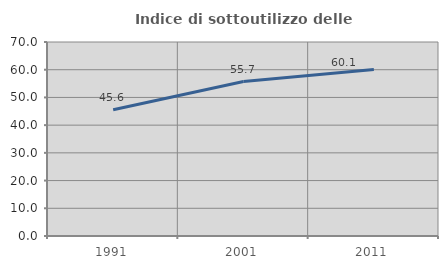
| Category | Indice di sottoutilizzo delle abitazioni  |
|---|---|
| 1991.0 | 45.57 |
| 2001.0 | 55.743 |
| 2011.0 | 60.073 |